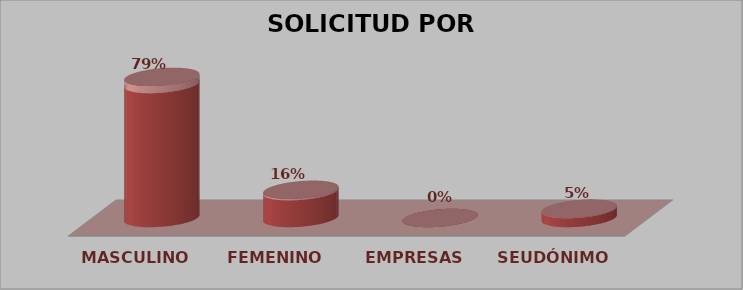
| Category | SOLICITUD POR GÉNERO | Series 1 |
|---|---|---|
| MASCULINO | 15 | 0.79 |
| FEMENINO | 3 | 0.16 |
| EMPRESAS | 0 | 0 |
| SEUDÓNIMO | 1 | 0.05 |